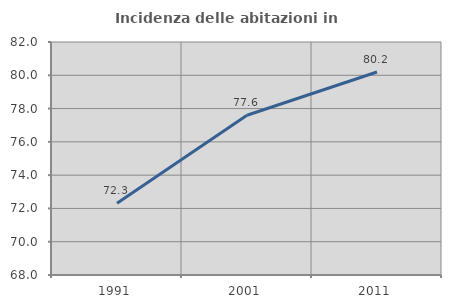
| Category | Incidenza delle abitazioni in proprietà  |
|---|---|
| 1991.0 | 72.305 |
| 2001.0 | 77.602 |
| 2011.0 | 80.195 |